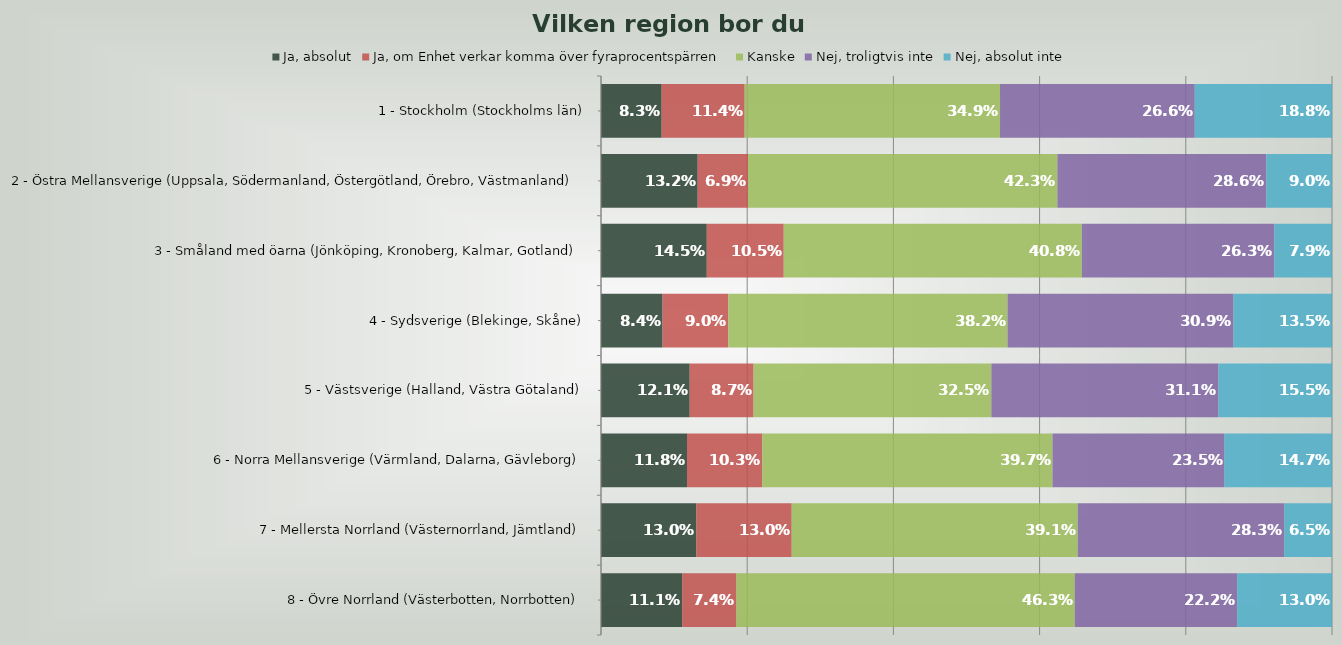
| Category | Ja, absolut | Ja, om Enhet verkar komma över fyraprocentspärren | Kanske | Nej, troligtvis inte | Nej, absolut inte |
|---|---|---|---|---|---|
| 1 - Stockholm (Stockholms län) | 0.083 | 0.114 | 0.349 | 0.266 | 0.188 |
| 2 - Östra Mellansverige (Uppsala, Södermanland, Östergötland, Örebro, Västmanland) | 0.132 | 0.069 | 0.423 | 0.286 | 0.09 |
| 3 - Småland med öarna (Jönköping, Kronoberg, Kalmar, Gotland) | 0.145 | 0.105 | 0.408 | 0.263 | 0.079 |
| 4 - Sydsverige (Blekinge, Skåne) | 0.084 | 0.09 | 0.382 | 0.309 | 0.135 |
| 5 - Västsverige (Halland, Västra Götaland) | 0.121 | 0.087 | 0.325 | 0.311 | 0.155 |
| 6 - Norra Mellansverige (Värmland, Dalarna, Gävleborg) | 0.118 | 0.103 | 0.397 | 0.235 | 0.147 |
| 7 - Mellersta Norrland (Västernorrland, Jämtland) | 0.13 | 0.13 | 0.391 | 0.283 | 0.065 |
| 8 - Övre Norrland (Västerbotten, Norrbotten) | 0.111 | 0.074 | 0.463 | 0.222 | 0.13 |